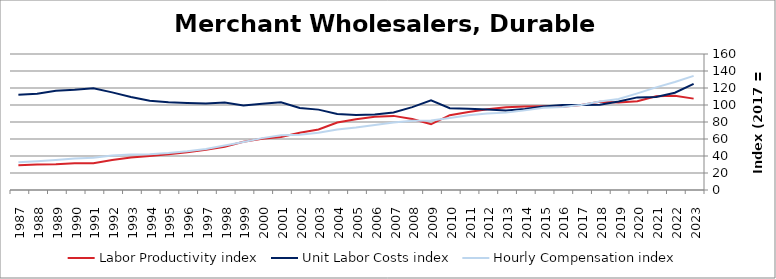
| Category | Labor Productivity index | Unit Labor Costs index | Hourly Compensation index |
|---|---|---|---|
| 2023.0 | 107.492 | 124.88 | 134.235 |
| 2022.0 | 110.991 | 114.4 | 126.973 |
| 2021.0 | 110.256 | 109.483 | 120.712 |
| 2020.0 | 104.338 | 108.967 | 113.694 |
| 2019.0 | 102.965 | 104.002 | 107.085 |
| 2018.0 | 103.918 | 100.294 | 104.224 |
| 2017.0 | 100 | 100 | 100 |
| 2016.0 | 97.81 | 99.94 | 97.751 |
| 2015.0 | 98.442 | 98.276 | 96.744 |
| 2014.0 | 98.167 | 95.435 | 93.685 |
| 2013.0 | 97.331 | 93.524 | 91.028 |
| 2012.0 | 95.09 | 94.763 | 90.111 |
| 2011.0 | 91.853 | 95.699 | 87.902 |
| 2010.0 | 87.996 | 96.294 | 84.736 |
| 2009.0 | 77.309 | 105.6 | 81.639 |
| 2008.0 | 83.539 | 97.507 | 81.457 |
| 2007.0 | 87.193 | 91.193 | 79.514 |
| 2006.0 | 86.131 | 88.842 | 76.521 |
| 2005.0 | 83.108 | 88.329 | 73.409 |
| 2004.0 | 79.381 | 89.544 | 71.081 |
| 2003.0 | 71.239 | 94.555 | 67.36 |
| 2002.0 | 67.405 | 96.487 | 65.037 |
| 2001.0 | 62.257 | 103.239 | 64.273 |
| 2000.0 | 60.201 | 101.399 | 61.043 |
| 1999.0 | 56.85 | 99.428 | 56.525 |
| 1998.0 | 50.903 | 102.894 | 52.376 |
| 1997.0 | 47.357 | 101.912 | 48.263 |
| 1996.0 | 44.49 | 102.431 | 45.571 |
| 1995.0 | 42.194 | 103.199 | 43.544 |
| 1994.0 | 40.036 | 104.97 | 42.026 |
| 1993.0 | 38.174 | 109.491 | 41.797 |
| 1992.0 | 35.345 | 114.859 | 40.597 |
| 1991.0 | 31.607 | 119.661 | 37.821 |
| 1990.0 | 31.521 | 117.887 | 37.16 |
| 1989.0 | 30.321 | 116.766 | 35.405 |
| 1988.0 | 29.954 | 113.111 | 33.881 |
| 1987.0 | 29.057 | 112.063 | 32.563 |